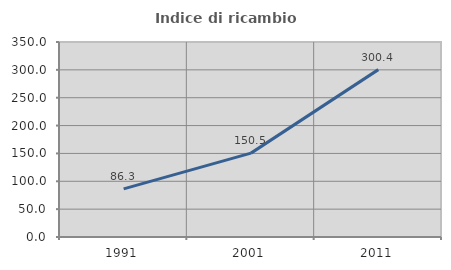
| Category | Indice di ricambio occupazionale  |
|---|---|
| 1991.0 | 86.286 |
| 2001.0 | 150.538 |
| 2011.0 | 300.418 |